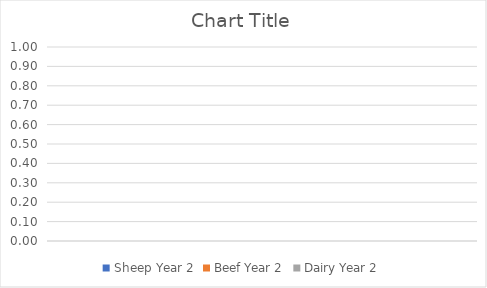
| Category | Sheep Year 2 | Beef Year 2 | Dairy Year 2 |
|---|---|---|---|
|  | 0 | 0 | 0 |
|  | 0 | 0 | 0 |
|  | 0 | 0 | 0 |
|  | 0 | 0 | 0 |
|  | 0 | 0 | 0 |